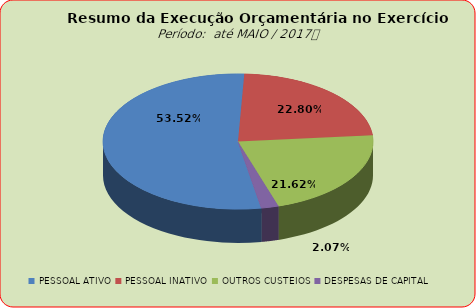
| Category | Series 0 |
|---|---|
| PESSOAL ATIVO | 60510180.54 |
| PESSOAL INATIVO | 25772064.53 |
| OUTROS CUSTEIOS | 24438134.56 |
| DESPESAS DE CAPITAL | 2335036.67 |